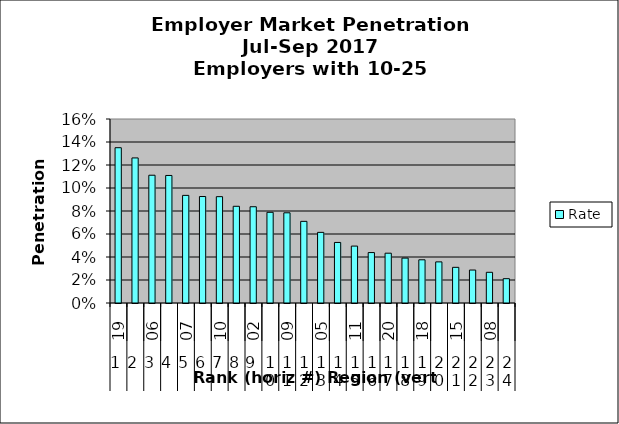
| Category | Rate |
|---|---|
| 0 | 0.135 |
| 1 | 0.126 |
| 2 | 0.111 |
| 3 | 0.111 |
| 4 | 0.094 |
| 5 | 0.093 |
| 6 | 0.092 |
| 7 | 0.084 |
| 8 | 0.084 |
| 9 | 0.079 |
| 10 | 0.078 |
| 11 | 0.071 |
| 12 | 0.061 |
| 13 | 0.053 |
| 14 | 0.049 |
| 15 | 0.044 |
| 16 | 0.043 |
| 17 | 0.039 |
| 18 | 0.038 |
| 19 | 0.036 |
| 20 | 0.031 |
| 21 | 0.029 |
| 22 | 0.027 |
| 23 | 0.021 |